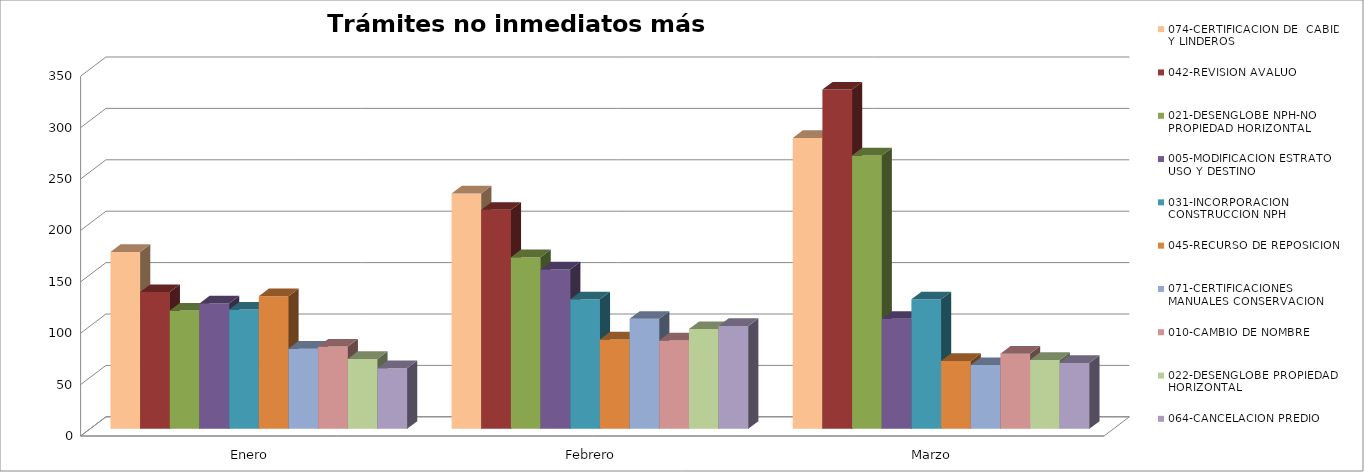
| Category | 074-CERTIFICACION DE  CABIDA Y LINDEROS  | 042-REVISION AVALUO | 021-DESENGLOBE NPH-NO PROPIEDAD HORIZONTAL | 005-MODIFICACION ESTRATO USO Y DESTINO | 031-INCORPORACION CONSTRUCCION NPH | 045-RECURSO DE REPOSICION | 071-CERTIFICACIONES MANUALES CONSERVACION | 010-CAMBIO DE NOMBRE | 022-DESENGLOBE PROPIEDAD HORIZONTAL | 064-CANCELACION PREDIO |
|---|---|---|---|---|---|---|---|---|---|---|
| Enero | 172 | 133 | 115 | 122 | 116 | 129 | 78 | 80 | 68 | 59 |
| Febrero | 229 | 213 | 167 | 155 | 126 | 87 | 107 | 86 | 97 | 100 |
| Marzo | 283 | 330 | 266 | 107 | 126 | 66 | 62 | 73 | 67 | 64 |